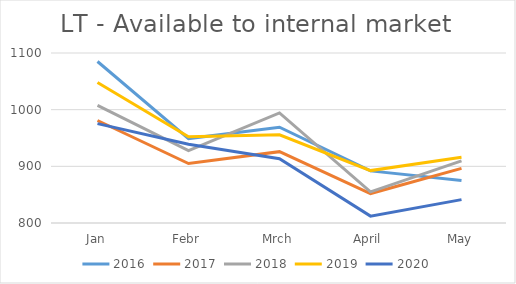
| Category | 2016 | 2017 | 2018 | 2019 | 2020 |
|---|---|---|---|---|---|
| Jan | 1085 | 980.897 | 1007.459 | 1047.997 | 975.391 |
| Febr | 949 | 904.876 | 927.635 | 952.035 | 939.05 |
| Mrch | 969 | 925.929 | 994.229 | 955.649 | 913.318 |
| April | 892 | 851.953 | 854.897 | 892.476 | 812.166 |
| May | 875 | 896.462 | 909.707 | 916.122 | 841.285 |